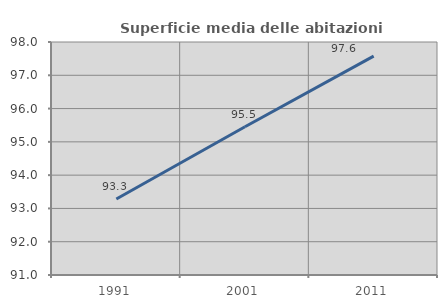
| Category | Superficie media delle abitazioni occupate |
|---|---|
| 1991.0 | 93.284 |
| 2001.0 | 95.453 |
| 2011.0 | 97.574 |